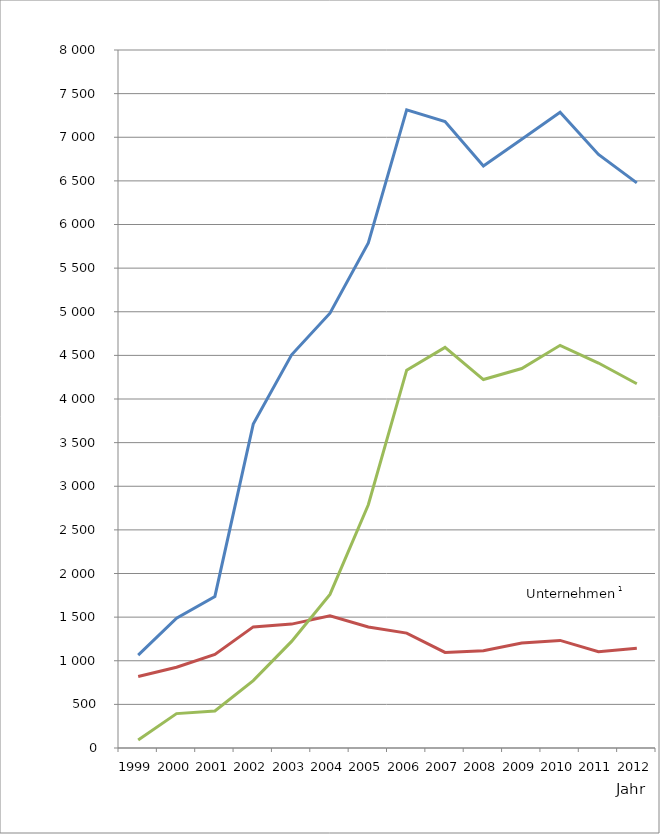
| Category | Verfahren
Insgesamt | von Unternehmen1 | von Verbrauchern |
|---|---|---|---|
| 1999.0 | 1064 | 820 | 91 |
| 2000.0 | 1488 | 926 | 394 |
| 2001.0 | 1737 | 1072 | 425 |
| 2002.0 | 3712 | 1388 | 772 |
| 2003.0 | 4507 | 1420 | 1222 |
| 2004.0 | 4984 | 1516 | 1761 |
| 2005.0 | 5788 | 1387 | 2788 |
| 2006.0 | 7315 | 1317 | 4330 |
| 2007.0 | 7181 | 1095 | 4592 |
| 2008.0 | 6671 | 1114 | 4223 |
| 2009.0 | 6976 | 1203 | 4349 |
| 2010.0 | 7287 | 1233 | 4615 |
| 2011.0 | 6803 | 1104 | 4412 |
| 2012.0 | 6477 | 1143 | 4175 |